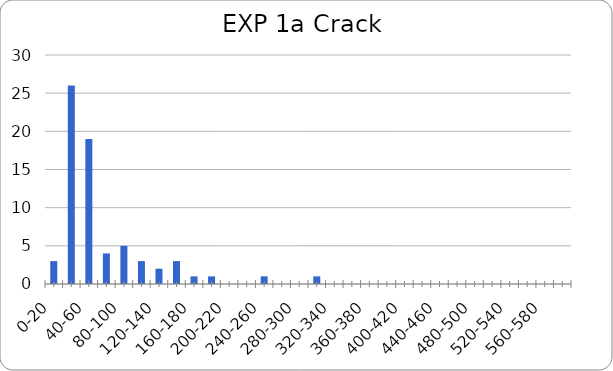
| Category | Series 0 |
|---|---|
| 0-20 | 3 |
| 20-40 | 26 |
| 40-60 | 19 |
| 60-80 | 4 |
| 80-100 | 5 |
| 100-120 | 3 |
| 120-140 | 2 |
| 140-160 | 3 |
| 160-180 | 1 |
| 180-200 | 1 |
| 200-220 | 0 |
| 220-240 | 0 |
| 240-260 | 1 |
| 260-280 | 0 |
| 280-300 | 0 |
| 300-320 | 1 |
| 320-340 | 0 |
| 340-360 | 0 |
| 360-380 | 0 |
| 380-400 | 0 |
| 400-420 | 0 |
| 420-440 | 0 |
| 440-460 | 0 |
| 460-480 | 0 |
| 480-500 | 0 |
| 500-520 | 0 |
| 520-540 | 0 |
| 540-560 | 0 |
| 560-580 | 0 |
| 580-600 | 0 |